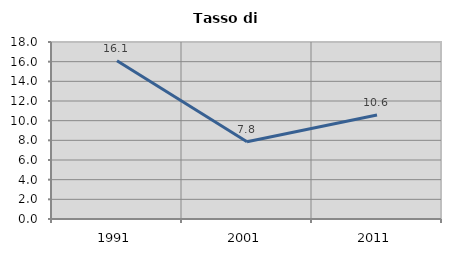
| Category | Tasso di disoccupazione   |
|---|---|
| 1991.0 | 16.098 |
| 2001.0 | 7.848 |
| 2011.0 | 10.582 |